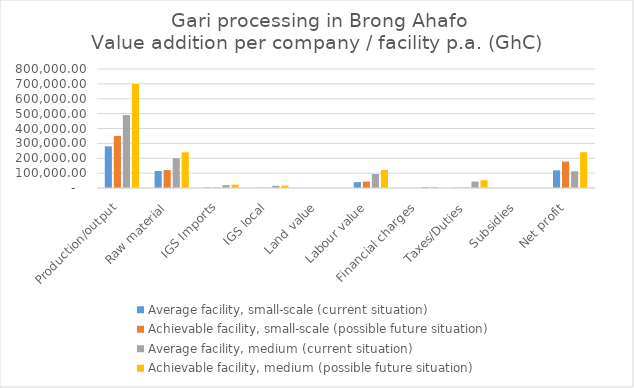
| Category | Average facility, small-scale (current situation) | Achievable facility, small-scale (possible future situation) | Average facility, medium (current situation) | Achievable facility, medium (possible future situation) |
|---|---|---|---|---|
| Production/output | 280000 | 350000 | 490000 | 700000 |
| Raw material | 114300 | 120000 | 200000 | 240000 |
| IGS Imports | 3212.5 | 3775 | 19237.5 | 22657.5 |
| IGS local | 1662.5 | 2100 | 14948.75 | 16288.75 |
| Land value | 0 | 0 | 0 | 0 |
| Labour value | 39615 | 43252.5 | 94272 | 121347 |
| Financial charges | 550 | 675 | 5870 | 7200 |
| Taxes/Duties | 1762.5 | 2075 | 43260 | 52197.5 |
| Subsidies | 0 | 0 | 0 | 0 |
| Net profit | 118897.5 | 178122.5 | 112411.75 | 240309.25 |